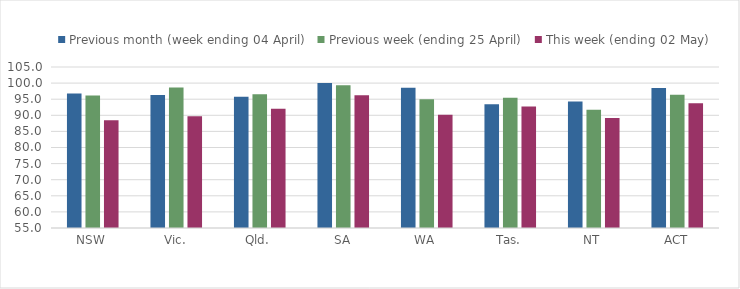
| Category | Previous month (week ending 04 April) | Previous week (ending 25 April) | This week (ending 02 May) |
|---|---|---|---|
| NSW | 96.803 | 96.119 | 88.449 |
| Vic. | 96.329 | 98.603 | 89.726 |
| Qld. | 95.762 | 96.571 | 92.063 |
| SA | 100 | 99.325 | 96.263 |
| WA | 98.524 | 95.001 | 90.138 |
| Tas. | 93.454 | 95.429 | 92.727 |
| NT | 94.271 | 91.698 | 89.153 |
| ACT | 98.5 | 96.389 | 93.742 |